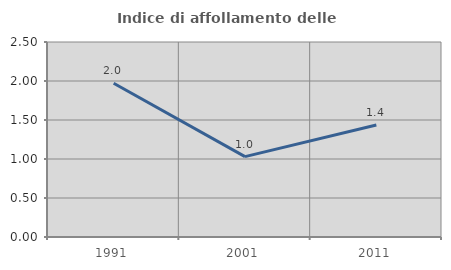
| Category | Indice di affollamento delle abitazioni  |
|---|---|
| 1991.0 | 1.97 |
| 2001.0 | 1.031 |
| 2011.0 | 1.435 |